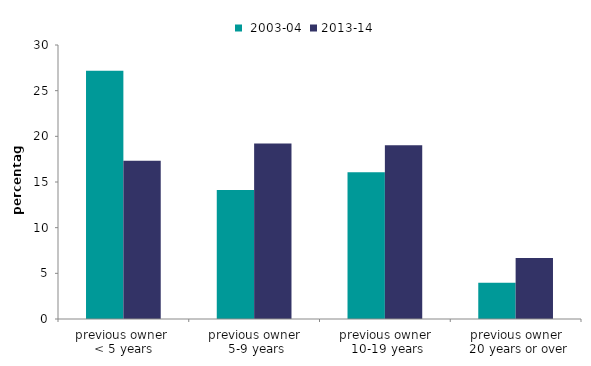
| Category |  2003-04 | 2013-14 |
|---|---|---|
| previous owner 
< 5 years | 27.17 | 17.319 |
| previous owner
 5-9 years | 14.131 | 19.205 |
| previous owner
 10-19 years | 16.063 | 19.019 |
| previous owner
 20 years or over | 3.965 | 6.689 |